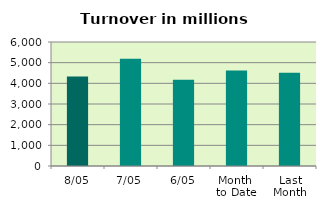
| Category | Series 0 |
|---|---|
| 8/05 | 4330.23 |
| 7/05 | 5190.32 |
| 6/05 | 4173.316 |
| Month 
to Date | 4619.831 |
| Last
Month | 4514.737 |